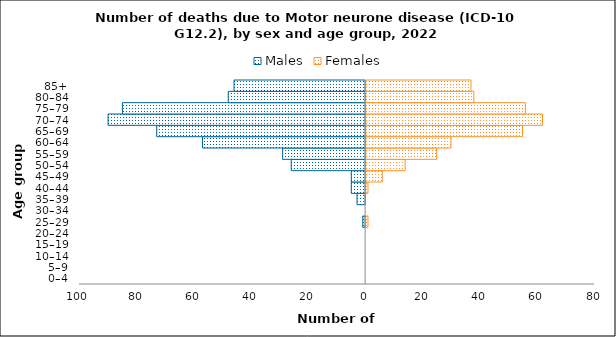
| Category | Males | Females |
|---|---|---|
| 0–4 | 0 | 0 |
| 5–9 | 0 | 0 |
| 10–14 | 0 | 0 |
| 15–19 | 0 | 0 |
| 20–24 | 0 | 0 |
| 25–29 | -1 | 1 |
| 30–34 | 0 | 0 |
| 35–39 | -3 | 0 |
| 40–44 | -5 | 1 |
| 45–49 | -5 | 6 |
| 50–54 | -26 | 14 |
| 55–59 | -29 | 25 |
| 60–64 | -57 | 30 |
| 65–69 | -73 | 55 |
| 70–74 | -90 | 62 |
| 75–79 | -85 | 56 |
| 80–84 | -48 | 38 |
| 85+ | -46 | 37 |